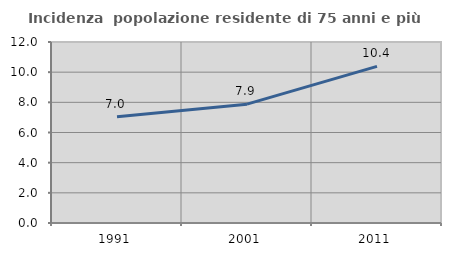
| Category | Incidenza  popolazione residente di 75 anni e più |
|---|---|
| 1991.0 | 7.037 |
| 2001.0 | 7.881 |
| 2011.0 | 10.387 |